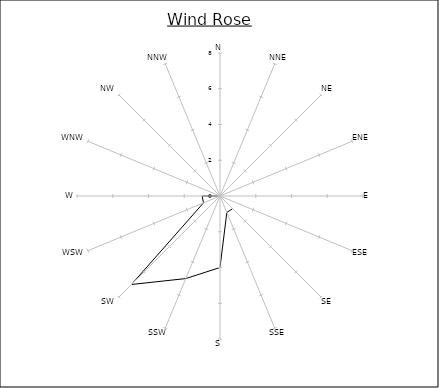
| Category | Series 0 |
|---|---|
| N | 0 |
| NNE | 0 |
| NE | 0 |
| ENE | 0 |
| E | 0 |
| ESE | 0 |
| SE | 1 |
| SSE | 1 |
| S | 4 |
| SSW | 5 |
| SW | 7 |
| WSW | 1 |
| W | 1 |
| WNW | 0 |
| NW | 0 |
| NNW | 0 |